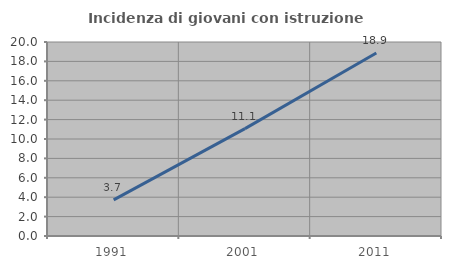
| Category | Incidenza di giovani con istruzione universitaria |
|---|---|
| 1991.0 | 3.728 |
| 2001.0 | 11.07 |
| 2011.0 | 18.858 |